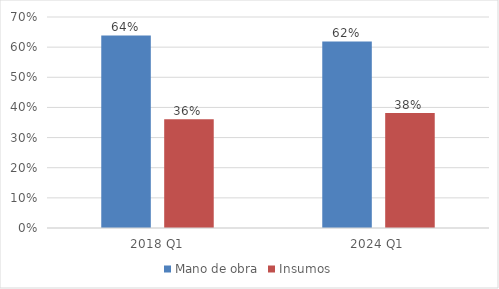
| Category | Mano de obra | Insumos |
|---|---|---|
| 2018 Q1 | 0.639 | 0.361 |
| 2024 Q1 | 0.619 | 0.381 |